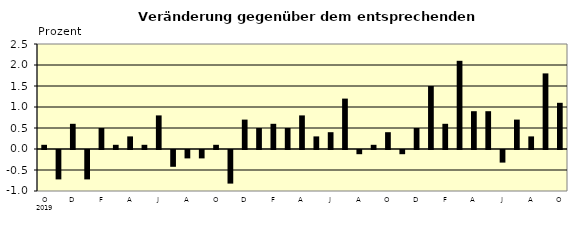
| Category | Series 0 |
|---|---|
| 0 | 0.1 |
| 1 | -0.7 |
| 2 | 0.6 |
| 3 | -0.7 |
| 4 | 0.5 |
| 5 | 0.1 |
| 6 | 0.3 |
| 7 | 0.1 |
| 8 | 0.8 |
| 9 | -0.4 |
| 10 | -0.2 |
| 11 | -0.2 |
| 12 | 0.1 |
| 13 | -0.8 |
| 14 | 0.7 |
| 15 | 0.5 |
| 16 | 0.6 |
| 17 | 0.5 |
| 18 | 0.8 |
| 19 | 0.3 |
| 20 | 0.4 |
| 21 | 1.2 |
| 22 | -0.1 |
| 23 | 0.1 |
| 24 | 0.4 |
| 25 | -0.1 |
| 26 | 0.5 |
| 27 | 1.5 |
| 28 | 0.6 |
| 29 | 2.1 |
| 30 | 0.9 |
| 31 | 0.9 |
| 32 | -0.3 |
| 33 | 0.7 |
| 34 | 0.3 |
| 35 | 1.8 |
| 36 | 1.1 |